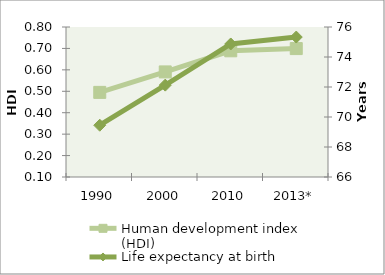
| Category | Human development index (HDI) |
|---|---|
| 1990 | 0.495 |
| 2000 | 0.59 |
| 2010 | 0.689 |
| 2013* | 0.699 |